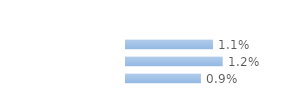
| Category | Series 0 |
|---|---|
| Immigrées | 0.011 |
| Descendantes d'immigré(s) | 0.012 |
| Ni immigrées, ni descendantes | 0.009 |